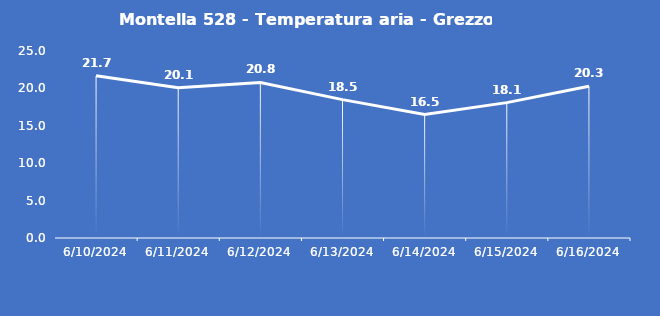
| Category | Montella 528 - Temperatura aria - Grezzo (°C) |
|---|---|
| 6/10/24 | 21.7 |
| 6/11/24 | 20.1 |
| 6/12/24 | 20.8 |
| 6/13/24 | 18.5 |
| 6/14/24 | 16.5 |
| 6/15/24 | 18.1 |
| 6/16/24 | 20.3 |